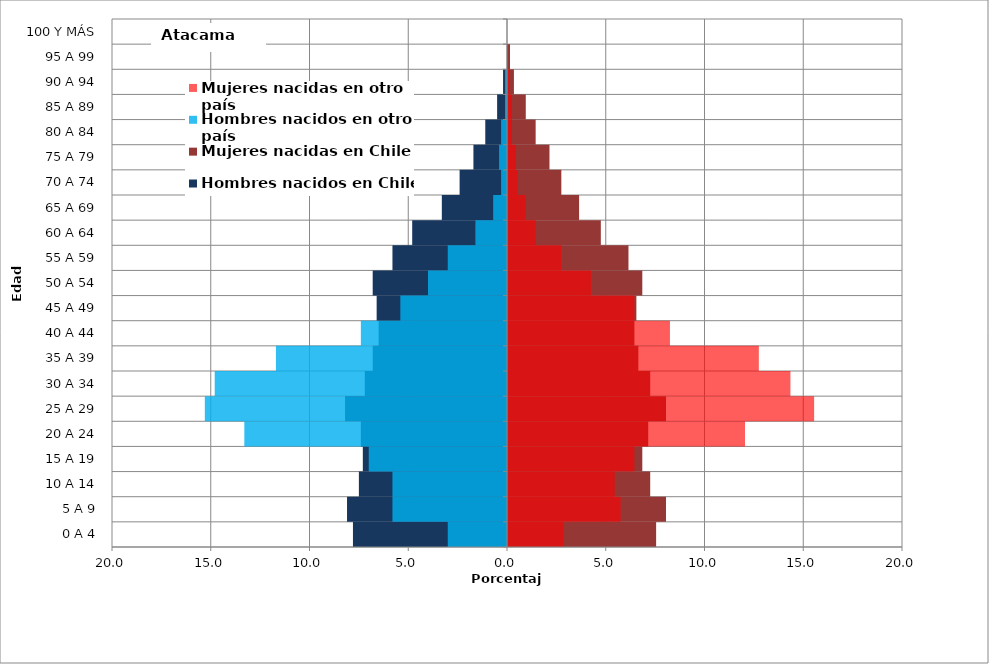
| Category | Hombres nacidos en Chile | Mujeres nacidas en Chile | Hombres nacidos en otro país | Mujeres nacidas en otro país |
|---|---|---|---|---|
| 0 A 4 | -7.8 | 7.5 | -3 | 2.8 |
| 5 A 9 | -8.1 | 8 | -5.8 | 5.7 |
| 10 A 14 | -7.5 | 7.2 | -5.8 | 5.4 |
| 15 A 19 | -7.3 | 6.8 | -7 | 6.4 |
| 20 A 24 | -7.4 | 7.1 | -13.3 | 12 |
| 25 A 29 | -8.2 | 8 | -15.3 | 15.5 |
| 30 A 34 | -7.2 | 7.2 | -14.8 | 14.3 |
| 35 A 39 | -6.8 | 6.6 | -11.7 | 12.7 |
| 40 A 44 | -6.5 | 6.4 | -7.4 | 8.2 |
| 45 A 49 | -6.6 | 6.5 | -5.4 | 6.4 |
| 50 A 54 | -6.8 | 6.8 | -4 | 4.2 |
| 55 A 59 | -5.8 | 6.1 | -3 | 2.7 |
| 60 A 64 | -4.8 | 4.7 | -1.6 | 1.4 |
| 65 A 69 | -3.3 | 3.6 | -0.7 | 0.9 |
| 70 A 74 | -2.4 | 2.7 | -0.3 | 0.5 |
| 75 A 79 | -1.7 | 2.1 | -0.4 | 0.4 |
| 80 A 84 | -1.1 | 1.4 | -0.3 | 0.2 |
| 85 A 89 | -0.5 | 0.9 | -0.1 | 0.2 |
| 90 A 94 | -0.2 | 0.3 | -0.1 | 0.1 |
| 95 A 99 | 0 | 0.1 | 0 | 0 |
| 100 Y MÁS | 0 | 0 | 0 | 0 |